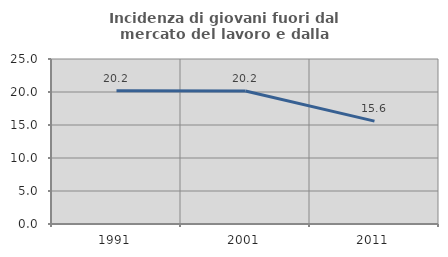
| Category | Incidenza di giovani fuori dal mercato del lavoro e dalla formazione  |
|---|---|
| 1991.0 | 20.187 |
| 2001.0 | 20.163 |
| 2011.0 | 15.583 |